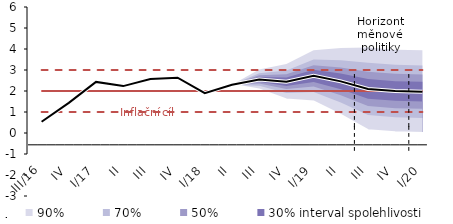
| Category | Inflation Target | Inflation Target - lower bound | Inflation Target - upper bound | linka | Střed předpovědi |
|---|---|---|---|---|---|
| III/16 | 2 | 1 | 3 | 0.533 | 0.533 |
| IV | 2 | 1 | 3 | 1.433 | 1.433 |
| I/17 | 2 | 1 | 3 | 2.433 | 2.433 |
| II | 2 | 1 | 3 | 2.233 | 2.233 |
| III | 2 | 1 | 3 | 2.567 | 2.567 |
| IV | 2 | 1 | 3 | 2.633 | 2.633 |
| I/18 | 2 | 1 | 3 | 1.9 | 1.9 |
| II | 2 | 1 | 3 | 2.3 | 2.3 |
| III | 2 | 1 | 3 | 2.549 | 2.549 |
| IV | 2 | 1 | 3 | 2.445 | 2.445 |
| I/19 | 2 | 1 | 3 | 2.723 | 2.723 |
| II | 2 | 1 | 3 | 2.459 | 2.459 |
| III | 2 | 1 | 3 | 2.1 | 2.1 |
| IV | 2 | 1 | 3 | 2 | 2 |
| I/20 | 2 | 1 | 3 | 1.967 | 1.967 |